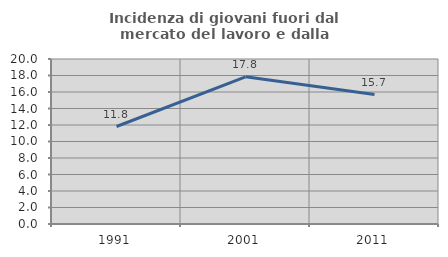
| Category | Incidenza di giovani fuori dal mercato del lavoro e dalla formazione  |
|---|---|
| 1991.0 | 11.818 |
| 2001.0 | 17.835 |
| 2011.0 | 15.684 |